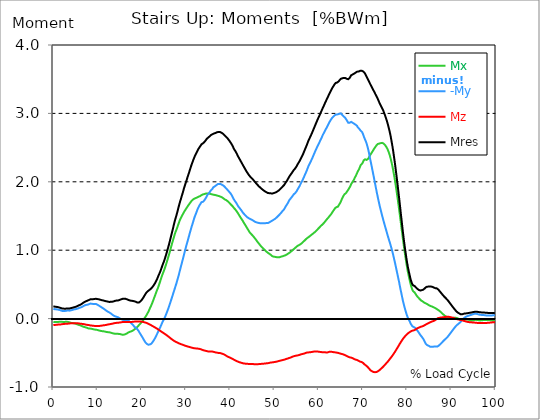
| Category |  Mx |  -My |  Mz |  Mres |
|---|---|---|---|---|
| 0.0 | -0.05 | 0.145 | -0.094 | 0.181 |
| 0.167348456675344 | -0.05 | 0.139 | -0.094 | 0.177 |
| 0.334696913350688 | -0.052 | 0.137 | -0.093 | 0.174 |
| 0.5020453700260321 | -0.052 | 0.135 | -0.092 | 0.173 |
| 0.669393826701376 | -0.05 | 0.135 | -0.09 | 0.172 |
| 0.83674228337672 | -0.052 | 0.133 | -0.089 | 0.169 |
| 1.0040907400520642 | -0.05 | 0.132 | -0.088 | 0.168 |
| 1.1621420602454444 | -0.048 | 0.13 | -0.086 | 0.165 |
| 1.3294905169207885 | -0.046 | 0.129 | -0.086 | 0.163 |
| 1.4968389735961325 | -0.045 | 0.125 | -0.085 | 0.16 |
| 1.6641874302714765 | -0.045 | 0.12 | -0.085 | 0.155 |
| 1.8315358869468206 | -0.046 | 0.115 | -0.084 | 0.151 |
| 1.9988843436221646 | -0.048 | 0.112 | -0.081 | 0.148 |
| 2.1662328002975086 | -0.048 | 0.111 | -0.08 | 0.147 |
| 2.333581256972853 | -0.049 | 0.111 | -0.079 | 0.146 |
| 2.5009297136481967 | -0.049 | 0.111 | -0.077 | 0.146 |
| 2.6682781703235405 | -0.048 | 0.112 | -0.076 | 0.145 |
| 2.8356266269988843 | -0.045 | 0.114 | -0.075 | 0.145 |
| 3.002975083674229 | -0.046 | 0.116 | -0.075 | 0.147 |
| 3.1703235403495724 | -0.048 | 0.12 | -0.075 | 0.15 |
| 3.337671997024917 | -0.049 | 0.119 | -0.074 | 0.148 |
| 3.4957233172182973 | -0.053 | 0.117 | -0.072 | 0.148 |
| 3.663071773893641 | -0.055 | 0.116 | -0.071 | 0.148 |
| 3.8304202305689854 | -0.058 | 0.119 | -0.07 | 0.151 |
| 3.997768687244329 | -0.062 | 0.121 | -0.068 | 0.154 |
| 4.165117143919673 | -0.065 | 0.125 | -0.068 | 0.156 |
| 4.332465600595017 | -0.066 | 0.128 | -0.067 | 0.159 |
| 4.499814057270361 | -0.067 | 0.13 | -0.067 | 0.163 |
| 4.667162513945706 | -0.068 | 0.134 | -0.068 | 0.165 |
| 4.834510970621049 | -0.071 | 0.135 | -0.07 | 0.169 |
| 5.001859427296393 | -0.074 | 0.138 | -0.07 | 0.172 |
| 5.169207883971737 | -0.077 | 0.141 | -0.07 | 0.175 |
| 5.336556340647081 | -0.083 | 0.143 | -0.07 | 0.179 |
| 5.503904797322425 | -0.089 | 0.146 | -0.07 | 0.185 |
| 5.671253253997769 | -0.09 | 0.151 | -0.07 | 0.191 |
| 5.82930457419115 | -0.093 | 0.156 | -0.071 | 0.195 |
| 5.996653030866494 | -0.097 | 0.16 | -0.074 | 0.2 |
| 6.164001487541838 | -0.101 | 0.163 | -0.075 | 0.205 |
| 6.331349944217181 | -0.106 | 0.166 | -0.076 | 0.212 |
| 6.498698400892526 | -0.112 | 0.172 | -0.077 | 0.219 |
| 6.66604685756787 | -0.116 | 0.178 | -0.079 | 0.227 |
| 6.833395314243213 | -0.12 | 0.185 | -0.08 | 0.235 |
| 7.000743770918558 | -0.123 | 0.191 | -0.083 | 0.241 |
| 7.168092227593902 | -0.126 | 0.196 | -0.085 | 0.249 |
| 7.335440684269246 | -0.129 | 0.199 | -0.088 | 0.253 |
| 7.50278914094459 | -0.133 | 0.201 | -0.09 | 0.257 |
| 7.6701375976199335 | -0.137 | 0.203 | -0.092 | 0.261 |
| 7.837486054295278 | -0.141 | 0.205 | -0.093 | 0.266 |
| 7.995537374488658 | -0.145 | 0.209 | -0.094 | 0.271 |
| 8.162885831164003 | -0.146 | 0.213 | -0.097 | 0.276 |
| 8.330234287839346 | -0.146 | 0.219 | -0.099 | 0.281 |
| 8.49758274451469 | -0.147 | 0.221 | -0.101 | 0.284 |
| 8.664931201190035 | -0.15 | 0.218 | -0.102 | 0.284 |
| 8.832279657865378 | -0.151 | 0.215 | -0.103 | 0.283 |
| 8.999628114540721 | -0.155 | 0.213 | -0.105 | 0.284 |
| 9.166976571216066 | -0.159 | 0.214 | -0.106 | 0.286 |
| 9.334325027891412 | -0.16 | 0.214 | -0.107 | 0.288 |
| 9.501673484566755 | -0.161 | 0.214 | -0.107 | 0.289 |
| 9.669021941242098 | -0.163 | 0.213 | -0.107 | 0.289 |
| 9.836370397917442 | -0.164 | 0.208 | -0.108 | 0.286 |
| 10.003718854592787 | -0.166 | 0.203 | -0.108 | 0.285 |
| 10.17106731126813 | -0.169 | 0.196 | -0.108 | 0.283 |
| 10.329118631461512 | -0.174 | 0.188 | -0.107 | 0.281 |
| 10.496467088136853 | -0.178 | 0.182 | -0.107 | 0.279 |
| 10.663815544812199 | -0.179 | 0.174 | -0.106 | 0.275 |
| 10.831164001487544 | -0.182 | 0.166 | -0.103 | 0.271 |
| 10.998512458162887 | -0.183 | 0.16 | -0.102 | 0.268 |
| 11.16586091483823 | -0.185 | 0.154 | -0.099 | 0.266 |
| 11.333209371513574 | -0.186 | 0.147 | -0.098 | 0.265 |
| 11.50055782818892 | -0.187 | 0.139 | -0.097 | 0.262 |
| 11.667906284864264 | -0.19 | 0.13 | -0.095 | 0.258 |
| 11.835254741539607 | -0.192 | 0.123 | -0.094 | 0.255 |
| 12.00260319821495 | -0.195 | 0.115 | -0.092 | 0.253 |
| 12.169951654890292 | -0.197 | 0.108 | -0.089 | 0.25 |
| 12.337300111565641 | -0.199 | 0.101 | -0.086 | 0.248 |
| 12.504648568240984 | -0.199 | 0.094 | -0.084 | 0.245 |
| 12.662699888434362 | -0.2 | 0.089 | -0.083 | 0.244 |
| 12.830048345109708 | -0.203 | 0.083 | -0.08 | 0.244 |
| 12.997396801785053 | -0.206 | 0.075 | -0.079 | 0.245 |
| 13.164745258460396 | -0.21 | 0.066 | -0.077 | 0.245 |
| 13.33209371513574 | -0.213 | 0.058 | -0.075 | 0.246 |
| 13.499442171811083 | -0.215 | 0.05 | -0.072 | 0.248 |
| 13.666790628486426 | -0.218 | 0.043 | -0.068 | 0.253 |
| 13.834139085161771 | -0.221 | 0.037 | -0.067 | 0.258 |
| 14.001487541837117 | -0.222 | 0.032 | -0.065 | 0.261 |
| 14.16883599851246 | -0.222 | 0.027 | -0.063 | 0.262 |
| 14.336184455187803 | -0.223 | 0.026 | -0.062 | 0.265 |
| 14.503532911863147 | -0.223 | 0.023 | -0.062 | 0.266 |
| 14.670881368538492 | -0.223 | 0.018 | -0.061 | 0.266 |
| 14.828932688731873 | -0.223 | 0.01 | -0.058 | 0.27 |
| 14.996281145407215 | -0.225 | 0.004 | -0.057 | 0.274 |
| 15.163629602082558 | -0.227 | -0.003 | -0.055 | 0.277 |
| 15.330978058757903 | -0.231 | -0.008 | -0.054 | 0.283 |
| 15.498326515433247 | -0.234 | -0.013 | -0.052 | 0.286 |
| 15.665674972108594 | -0.236 | -0.018 | -0.05 | 0.289 |
| 15.833023428783937 | -0.235 | -0.019 | -0.05 | 0.289 |
| 16.00037188545928 | -0.234 | -0.019 | -0.049 | 0.29 |
| 16.167720342134626 | -0.232 | -0.019 | -0.049 | 0.292 |
| 16.335068798809967 | -0.227 | -0.021 | -0.05 | 0.289 |
| 16.502417255485312 | -0.222 | -0.022 | -0.05 | 0.285 |
| 16.669765712160658 | -0.215 | -0.025 | -0.05 | 0.281 |
| 16.837114168836 | -0.208 | -0.027 | -0.052 | 0.276 |
| 17.004462625511344 | -0.201 | -0.031 | -0.052 | 0.272 |
| 17.16251394570472 | -0.196 | -0.039 | -0.052 | 0.268 |
| 17.32986240238007 | -0.192 | -0.049 | -0.05 | 0.265 |
| 17.497210859055414 | -0.19 | -0.061 | -0.049 | 0.263 |
| 17.664559315730756 | -0.185 | -0.071 | -0.049 | 0.261 |
| 17.8319077724061 | -0.179 | -0.081 | -0.048 | 0.259 |
| 17.999256229081443 | -0.174 | -0.093 | -0.046 | 0.258 |
| 18.166604685756788 | -0.166 | -0.107 | -0.045 | 0.255 |
| 18.333953142432133 | -0.157 | -0.12 | -0.044 | 0.253 |
| 18.501301599107478 | -0.148 | -0.13 | -0.044 | 0.253 |
| 18.668650055782823 | -0.141 | -0.135 | -0.044 | 0.245 |
| 18.835998512458165 | -0.132 | -0.145 | -0.044 | 0.237 |
| 19.00334696913351 | -0.121 | -0.156 | -0.044 | 0.235 |
| 19.170695425808855 | -0.108 | -0.17 | -0.043 | 0.232 |
| 19.338043882484197 | -0.097 | -0.187 | -0.043 | 0.235 |
| 19.496095202677576 | -0.086 | -0.208 | -0.043 | 0.243 |
| 19.66344365935292 | -0.074 | -0.223 | -0.043 | 0.25 |
| 19.830792116028263 | -0.061 | -0.243 | -0.044 | 0.263 |
| 19.998140572703612 | -0.048 | -0.259 | -0.045 | 0.275 |
| 20.165489029378953 | -0.035 | -0.276 | -0.046 | 0.288 |
| 20.3328374860543 | -0.021 | -0.297 | -0.049 | 0.306 |
| 20.500185942729644 | -0.005 | -0.315 | -0.052 | 0.324 |
| 20.667534399404985 | 0.012 | -0.333 | -0.055 | 0.343 |
| 20.83488285608033 | 0.027 | -0.35 | -0.058 | 0.36 |
| 21.002231312755672 | 0.044 | -0.364 | -0.062 | 0.377 |
| 21.16957976943102 | 0.063 | -0.372 | -0.067 | 0.387 |
| 21.336928226106362 | 0.083 | -0.378 | -0.071 | 0.399 |
| 21.504276682781704 | 0.103 | -0.382 | -0.076 | 0.408 |
| 21.67162513945705 | 0.126 | -0.382 | -0.081 | 0.417 |
| 21.82967645965043 | 0.151 | -0.378 | -0.086 | 0.426 |
| 21.997024916325774 | 0.174 | -0.373 | -0.093 | 0.434 |
| 22.16437337300112 | 0.199 | -0.366 | -0.099 | 0.443 |
| 22.33172182967646 | 0.225 | -0.354 | -0.106 | 0.455 |
| 22.499070286351806 | 0.253 | -0.337 | -0.112 | 0.47 |
| 22.666418743027148 | 0.281 | -0.321 | -0.117 | 0.485 |
| 22.833767199702496 | 0.311 | -0.303 | -0.124 | 0.502 |
| 23.00111565637784 | 0.339 | -0.284 | -0.13 | 0.52 |
| 23.168464113053183 | 0.369 | -0.263 | -0.137 | 0.539 |
| 23.335812569728528 | 0.399 | -0.24 | -0.143 | 0.561 |
| 23.50316102640387 | 0.426 | -0.218 | -0.15 | 0.586 |
| 23.670509483079215 | 0.452 | -0.194 | -0.156 | 0.612 |
| 23.83785793975456 | 0.483 | -0.169 | -0.164 | 0.639 |
| 23.995909259947936 | 0.515 | -0.148 | -0.172 | 0.662 |
| 24.163257716623285 | 0.548 | -0.126 | -0.179 | 0.688 |
| 24.330606173298627 | 0.581 | -0.102 | -0.187 | 0.717 |
| 24.49795462997397 | 0.613 | -0.076 | -0.194 | 0.747 |
| 24.665303086649313 | 0.645 | -0.05 | -0.201 | 0.779 |
| 24.83265154332466 | 0.674 | -0.03 | -0.208 | 0.808 |
| 25.0 | 0.699 | -0.012 | -0.215 | 0.835 |
| 25.167348456675345 | 0.73 | 0.012 | -0.222 | 0.867 |
| 25.334696913350694 | 0.763 | 0.037 | -0.23 | 0.902 |
| 25.502045370026035 | 0.796 | 0.063 | -0.237 | 0.937 |
| 25.669393826701377 | 0.831 | 0.092 | -0.245 | 0.973 |
| 25.836742283376722 | 0.866 | 0.12 | -0.253 | 1.012 |
| 26.004090740052067 | 0.903 | 0.15 | -0.262 | 1.05 |
| 26.17143919672741 | 0.941 | 0.181 | -0.27 | 1.09 |
| 26.329490516920792 | 0.978 | 0.213 | -0.279 | 1.132 |
| 26.49683897359613 | 1.018 | 0.245 | -0.288 | 1.175 |
| 26.66418743027148 | 1.058 | 0.28 | -0.297 | 1.219 |
| 26.831535886946828 | 1.098 | 0.312 | -0.306 | 1.263 |
| 26.998884343622166 | 1.134 | 0.347 | -0.312 | 1.307 |
| 27.166232800297514 | 1.172 | 0.382 | -0.32 | 1.351 |
| 27.333581256972852 | 1.208 | 0.415 | -0.328 | 1.395 |
| 27.5009297136482 | 1.244 | 0.449 | -0.334 | 1.437 |
| 27.668278170323543 | 1.274 | 0.484 | -0.339 | 1.475 |
| 27.835626626998888 | 1.301 | 0.517 | -0.343 | 1.511 |
| 28.002975083674233 | 1.33 | 0.556 | -0.348 | 1.551 |
| 28.170323540349575 | 1.361 | 0.594 | -0.354 | 1.592 |
| 28.33767199702492 | 1.392 | 0.632 | -0.36 | 1.635 |
| 28.50502045370026 | 1.422 | 0.676 | -0.364 | 1.676 |
| 28.663071773893645 | 1.449 | 0.719 | -0.369 | 1.714 |
| 28.830420230568986 | 1.471 | 0.76 | -0.373 | 1.748 |
| 28.99776868724433 | 1.493 | 0.8 | -0.377 | 1.786 |
| 29.165117143919673 | 1.514 | 0.841 | -0.381 | 1.821 |
| 29.33246560059502 | 1.533 | 0.884 | -0.385 | 1.857 |
| 29.499814057270367 | 1.554 | 0.925 | -0.388 | 1.897 |
| 29.66716251394571 | 1.572 | 0.968 | -0.394 | 1.933 |
| 29.834510970621054 | 1.588 | 1.01 | -0.397 | 1.965 |
| 30.00185942729639 | 1.605 | 1.052 | -0.4 | 1.999 |
| 30.169207883971744 | 1.622 | 1.09 | -0.404 | 2.032 |
| 30.33655634064708 | 1.637 | 1.128 | -0.408 | 2.067 |
| 30.50390479732243 | 1.654 | 1.168 | -0.41 | 2.099 |
| 30.671253253997772 | 1.67 | 1.206 | -0.413 | 2.132 |
| 30.829304574191156 | 1.685 | 1.246 | -0.417 | 2.166 |
| 30.996653030866494 | 1.699 | 1.284 | -0.419 | 2.2 |
| 31.164001487541842 | 1.714 | 1.323 | -0.423 | 2.235 |
| 31.331349944217187 | 1.726 | 1.359 | -0.426 | 2.266 |
| 31.498698400892525 | 1.737 | 1.392 | -0.428 | 2.294 |
| 31.666046857567874 | 1.746 | 1.428 | -0.431 | 2.324 |
| 31.833395314243212 | 1.752 | 1.465 | -0.434 | 2.351 |
| 32.00074377091856 | 1.757 | 1.497 | -0.435 | 2.377 |
| 32.1680922275939 | 1.763 | 1.523 | -0.435 | 2.399 |
| 32.33544068426925 | 1.766 | 1.551 | -0.436 | 2.421 |
| 32.50278914094459 | 1.77 | 1.581 | -0.437 | 2.444 |
| 32.670137597619934 | 1.775 | 1.608 | -0.439 | 2.465 |
| 32.83748605429528 | 1.782 | 1.628 | -0.441 | 2.484 |
| 33.004834510970625 | 1.787 | 1.652 | -0.443 | 2.501 |
| 33.162885831164004 | 1.791 | 1.668 | -0.445 | 2.515 |
| 33.33023428783935 | 1.797 | 1.686 | -0.448 | 2.532 |
| 33.497582744514695 | 1.805 | 1.702 | -0.452 | 2.548 |
| 33.664931201190036 | 1.81 | 1.705 | -0.457 | 2.555 |
| 33.83227965786538 | 1.817 | 1.708 | -0.462 | 2.563 |
| 33.99962811454073 | 1.821 | 1.72 | -0.465 | 2.575 |
| 34.16697657121607 | 1.821 | 1.732 | -0.467 | 2.583 |
| 34.33432502789141 | 1.825 | 1.748 | -0.47 | 2.596 |
| 34.50167348456676 | 1.828 | 1.766 | -0.472 | 2.612 |
| 34.6690219412421 | 1.83 | 1.787 | -0.475 | 2.627 |
| 34.83637039791744 | 1.828 | 1.809 | -0.476 | 2.641 |
| 35.00371885459279 | 1.828 | 1.815 | -0.48 | 2.646 |
| 35.17106731126814 | 1.828 | 1.832 | -0.481 | 2.658 |
| 35.338415767943474 | 1.827 | 1.843 | -0.483 | 2.665 |
| 35.49646708813686 | 1.823 | 1.863 | -0.48 | 2.676 |
| 35.6638155448122 | 1.821 | 1.879 | -0.48 | 2.685 |
| 35.831164001487544 | 1.817 | 1.893 | -0.481 | 2.693 |
| 35.998512458162885 | 1.815 | 1.901 | -0.483 | 2.697 |
| 36.165860914838234 | 1.812 | 1.92 | -0.484 | 2.705 |
| 36.333209371513576 | 1.809 | 1.926 | -0.488 | 2.707 |
| 36.50055782818892 | 1.808 | 1.933 | -0.492 | 2.71 |
| 36.667906284864266 | 1.806 | 1.941 | -0.494 | 2.714 |
| 36.83525474153961 | 1.803 | 1.95 | -0.495 | 2.719 |
| 37.002603198214956 | 1.796 | 1.961 | -0.498 | 2.724 |
| 37.1699516548903 | 1.796 | 1.966 | -0.499 | 2.728 |
| 37.337300111565646 | 1.794 | 1.969 | -0.502 | 2.729 |
| 37.50464856824098 | 1.79 | 1.969 | -0.502 | 2.728 |
| 37.66269988843437 | 1.786 | 1.97 | -0.503 | 2.728 |
| 37.83004834510971 | 1.782 | 1.966 | -0.506 | 2.724 |
| 37.99739680178505 | 1.777 | 1.963 | -0.51 | 2.719 |
| 38.16474525846039 | 1.772 | 1.955 | -0.512 | 2.711 |
| 38.33209371513574 | 1.764 | 1.948 | -0.516 | 2.703 |
| 38.49944217181109 | 1.755 | 1.942 | -0.521 | 2.694 |
| 38.666790628486424 | 1.747 | 1.93 | -0.526 | 2.683 |
| 38.83413908516178 | 1.739 | 1.92 | -0.533 | 2.671 |
| 39.001487541837115 | 1.734 | 1.908 | -0.539 | 2.662 |
| 39.16883599851246 | 1.729 | 1.898 | -0.546 | 2.654 |
| 39.336184455187805 | 1.72 | 1.885 | -0.554 | 2.64 |
| 39.503532911863154 | 1.711 | 1.872 | -0.559 | 2.626 |
| 39.670881368538495 | 1.701 | 1.859 | -0.563 | 2.612 |
| 39.83822982521384 | 1.689 | 1.848 | -0.568 | 2.596 |
| 39.996281145407224 | 1.677 | 1.836 | -0.573 | 2.582 |
| 40.163629602082565 | 1.666 | 1.822 | -0.577 | 2.565 |
| 40.33097805875791 | 1.657 | 1.803 | -0.583 | 2.547 |
| 40.498326515433256 | 1.645 | 1.782 | -0.59 | 2.526 |
| 40.6656749721086 | 1.631 | 1.761 | -0.595 | 2.505 |
| 40.83302342878393 | 1.617 | 1.741 | -0.6 | 2.481 |
| 41.00037188545929 | 1.604 | 1.724 | -0.606 | 2.463 |
| 41.16772034213463 | 1.594 | 1.71 | -0.612 | 2.448 |
| 41.33506879880997 | 1.581 | 1.693 | -0.618 | 2.428 |
| 41.50241725548531 | 1.564 | 1.676 | -0.623 | 2.408 |
| 41.66976571216066 | 1.547 | 1.655 | -0.627 | 2.385 |
| 41.837114168836 | 1.53 | 1.639 | -0.632 | 2.364 |
| 42.004462625511344 | 1.512 | 1.625 | -0.636 | 2.345 |
| 42.17181108218669 | 1.495 | 1.612 | -0.639 | 2.325 |
| 42.32986240238007 | 1.477 | 1.599 | -0.643 | 2.306 |
| 42.497210859055414 | 1.461 | 1.583 | -0.646 | 2.286 |
| 42.66455931573076 | 1.444 | 1.568 | -0.649 | 2.267 |
| 42.831907772406105 | 1.428 | 1.55 | -0.653 | 2.246 |
| 42.999256229081446 | 1.409 | 1.541 | -0.655 | 2.228 |
| 43.16660468575679 | 1.391 | 1.526 | -0.657 | 2.209 |
| 43.33395314243214 | 1.374 | 1.514 | -0.658 | 2.19 |
| 43.50130159910748 | 1.356 | 1.503 | -0.659 | 2.172 |
| 43.66865005578282 | 1.338 | 1.49 | -0.661 | 2.152 |
| 43.83599851245817 | 1.32 | 1.483 | -0.661 | 2.135 |
| 44.00334696913351 | 1.302 | 1.475 | -0.662 | 2.12 |
| 44.17069542580886 | 1.285 | 1.468 | -0.662 | 2.103 |
| 44.3380438824842 | 1.267 | 1.462 | -0.662 | 2.089 |
| 44.49609520267758 | 1.252 | 1.457 | -0.663 | 2.075 |
| 44.66344365935292 | 1.237 | 1.454 | -0.663 | 2.065 |
| 44.83079211602827 | 1.23 | 1.446 | -0.665 | 2.054 |
| 44.99814057270361 | 1.219 | 1.441 | -0.665 | 2.044 |
| 45.16548902937895 | 1.206 | 1.434 | -0.665 | 2.031 |
| 45.332837486054295 | 1.192 | 1.427 | -0.666 | 2.017 |
| 45.500185942729644 | 1.179 | 1.419 | -0.666 | 2.004 |
| 45.66753439940499 | 1.165 | 1.414 | -0.667 | 1.991 |
| 45.83488285608033 | 1.151 | 1.409 | -0.667 | 1.979 |
| 46.00223131275568 | 1.137 | 1.406 | -0.667 | 1.968 |
| 46.16957976943102 | 1.121 | 1.403 | -0.667 | 1.955 |
| 46.336928226106366 | 1.107 | 1.401 | -0.666 | 1.943 |
| 46.50427668278171 | 1.094 | 1.397 | -0.666 | 1.932 |
| 46.671625139457056 | 1.08 | 1.395 | -0.665 | 1.921 |
| 46.829676459650436 | 1.067 | 1.394 | -0.663 | 1.912 |
| 46.99702491632577 | 1.054 | 1.395 | -0.662 | 1.902 |
| 47.16437337300112 | 1.043 | 1.394 | -0.661 | 1.893 |
| 47.33172182967646 | 1.031 | 1.394 | -0.659 | 1.884 |
| 47.49907028635181 | 1.021 | 1.394 | -0.659 | 1.876 |
| 47.66641874302716 | 1.01 | 1.394 | -0.658 | 1.868 |
| 47.83376719970249 | 1.001 | 1.394 | -0.657 | 1.861 |
| 48.001115656377834 | 0.99 | 1.395 | -0.655 | 1.854 |
| 48.16846411305319 | 0.979 | 1.397 | -0.654 | 1.848 |
| 48.33581256972853 | 0.97 | 1.397 | -0.653 | 1.843 |
| 48.50316102640387 | 0.963 | 1.397 | -0.652 | 1.836 |
| 48.67050948307921 | 0.955 | 1.401 | -0.65 | 1.834 |
| 48.837857939754564 | 0.948 | 1.406 | -0.648 | 1.834 |
| 49.005206396429905 | 0.939 | 1.415 | -0.644 | 1.834 |
| 49.163257716623285 | 0.932 | 1.421 | -0.643 | 1.831 |
| 49.33060617329863 | 0.92 | 1.428 | -0.641 | 1.83 |
| 49.49795462997397 | 0.912 | 1.432 | -0.64 | 1.828 |
| 49.66530308664932 | 0.91 | 1.439 | -0.639 | 1.831 |
| 49.832651543324666 | 0.906 | 1.446 | -0.637 | 1.835 |
| 50.0 | 0.903 | 1.453 | -0.635 | 1.839 |
| 50.16734845667534 | 0.902 | 1.461 | -0.634 | 1.843 |
| 50.33469691335069 | 0.901 | 1.468 | -0.631 | 1.846 |
| 50.50204537002604 | 0.898 | 1.479 | -0.63 | 1.853 |
| 50.66939382670139 | 0.895 | 1.49 | -0.626 | 1.861 |
| 50.836742283376715 | 0.895 | 1.501 | -0.623 | 1.867 |
| 51.00409074005207 | 0.895 | 1.512 | -0.619 | 1.876 |
| 51.17143919672741 | 0.898 | 1.523 | -0.617 | 1.885 |
| 51.32949051692079 | 0.902 | 1.533 | -0.614 | 1.894 |
| 51.496838973596134 | 0.906 | 1.547 | -0.612 | 1.907 |
| 51.66418743027148 | 0.908 | 1.56 | -0.609 | 1.919 |
| 51.831535886946824 | 0.911 | 1.574 | -0.606 | 1.93 |
| 51.99888434362217 | 0.916 | 1.586 | -0.604 | 1.941 |
| 52.16623280029752 | 0.92 | 1.597 | -0.6 | 1.952 |
| 52.33358125697285 | 0.924 | 1.617 | -0.597 | 1.969 |
| 52.5009297136482 | 0.926 | 1.637 | -0.594 | 1.986 |
| 52.668278170323546 | 0.932 | 1.653 | -0.59 | 2.001 |
| 52.835626626998895 | 0.939 | 1.667 | -0.587 | 2.017 |
| 53.00297508367424 | 0.947 | 1.688 | -0.583 | 2.036 |
| 53.17032354034958 | 0.954 | 1.71 | -0.579 | 2.057 |
| 53.33767199702492 | 0.961 | 1.729 | -0.575 | 2.075 |
| 53.50502045370027 | 0.968 | 1.745 | -0.573 | 2.092 |
| 53.663071773893655 | 0.975 | 1.759 | -0.569 | 2.107 |
| 53.83042023056899 | 0.986 | 1.77 | -0.565 | 2.121 |
| 53.99776868724433 | 0.996 | 1.785 | -0.559 | 2.137 |
| 54.16511714391967 | 1.006 | 1.8 | -0.552 | 2.154 |
| 54.33246560059503 | 1.015 | 1.815 | -0.551 | 2.17 |
| 54.49981405727037 | 1.023 | 1.826 | -0.547 | 2.183 |
| 54.667162513945705 | 1.034 | 1.835 | -0.545 | 2.195 |
| 54.834510970621054 | 1.043 | 1.848 | -0.542 | 2.21 |
| 55.0018594272964 | 1.053 | 1.862 | -0.541 | 2.227 |
| 55.169207883971744 | 1.061 | 1.883 | -0.539 | 2.249 |
| 55.336556340647086 | 1.067 | 1.901 | -0.537 | 2.267 |
| 55.50390479732243 | 1.074 | 1.919 | -0.534 | 2.284 |
| 55.671253253997776 | 1.079 | 1.938 | -0.53 | 2.303 |
| 55.83860171067312 | 1.085 | 1.96 | -0.526 | 2.324 |
| 55.9966530308665 | 1.093 | 1.982 | -0.523 | 2.345 |
| 56.16400148754184 | 1.102 | 2.003 | -0.52 | 2.366 |
| 56.33134994421718 | 1.111 | 2.022 | -0.517 | 2.387 |
| 56.498698400892536 | 1.123 | 2.046 | -0.515 | 2.412 |
| 56.66604685756788 | 1.133 | 2.071 | -0.512 | 2.439 |
| 56.83339531424321 | 1.143 | 2.095 | -0.508 | 2.465 |
| 57.00074377091856 | 1.155 | 2.12 | -0.503 | 2.49 |
| 57.16809222759391 | 1.165 | 2.145 | -0.501 | 2.516 |
| 57.33544068426925 | 1.173 | 2.17 | -0.497 | 2.542 |
| 57.5027891409446 | 1.182 | 2.2 | -0.495 | 2.572 |
| 57.670137597619934 | 1.19 | 2.227 | -0.494 | 2.6 |
| 57.83748605429528 | 1.197 | 2.249 | -0.494 | 2.622 |
| 58.004834510970625 | 1.208 | 2.271 | -0.493 | 2.646 |
| 58.16288583116401 | 1.215 | 2.294 | -0.492 | 2.67 |
| 58.330234287839346 | 1.225 | 2.316 | -0.489 | 2.693 |
| 58.497582744514695 | 1.232 | 2.339 | -0.488 | 2.717 |
| 58.66493120119004 | 1.24 | 2.364 | -0.485 | 2.742 |
| 58.832279657865385 | 1.249 | 2.391 | -0.483 | 2.769 |
| 58.999628114540734 | 1.258 | 2.415 | -0.481 | 2.795 |
| 59.16697657121607 | 1.267 | 2.44 | -0.48 | 2.821 |
| 59.33432502789142 | 1.277 | 2.466 | -0.48 | 2.848 |
| 59.50167348456676 | 1.289 | 2.488 | -0.481 | 2.871 |
| 59.66902194124211 | 1.299 | 2.514 | -0.481 | 2.899 |
| 59.83637039791745 | 1.311 | 2.535 | -0.483 | 2.923 |
| 60.00371885459278 | 1.321 | 2.556 | -0.484 | 2.946 |
| 60.17106731126813 | 1.333 | 2.578 | -0.486 | 2.969 |
| 60.33841576794349 | 1.345 | 2.601 | -0.488 | 2.994 |
| 60.49646708813685 | 1.356 | 2.625 | -0.489 | 3.018 |
| 60.6638155448122 | 1.366 | 2.646 | -0.49 | 3.043 |
| 60.831164001487544 | 1.375 | 2.672 | -0.49 | 3.067 |
| 60.99851245816289 | 1.386 | 2.694 | -0.49 | 3.09 |
| 61.16586091483824 | 1.397 | 2.715 | -0.492 | 3.114 |
| 61.333209371513576 | 1.41 | 2.737 | -0.493 | 3.138 |
| 61.50055782818892 | 1.425 | 2.757 | -0.493 | 3.163 |
| 61.667906284864266 | 1.437 | 2.777 | -0.494 | 3.186 |
| 61.835254741539615 | 1.452 | 2.795 | -0.495 | 3.208 |
| 62.002603198214956 | 1.465 | 2.817 | -0.494 | 3.23 |
| 62.16995165489029 | 1.476 | 2.84 | -0.49 | 3.254 |
| 62.33730011156564 | 1.49 | 2.862 | -0.486 | 3.277 |
| 62.504648568240995 | 1.503 | 2.881 | -0.485 | 3.299 |
| 62.67199702491633 | 1.515 | 2.899 | -0.484 | 3.32 |
| 62.83004834510971 | 1.529 | 2.916 | -0.485 | 3.341 |
| 62.99739680178505 | 1.546 | 2.932 | -0.486 | 3.363 |
| 63.1647452584604 | 1.564 | 2.945 | -0.49 | 3.383 |
| 63.33209371513575 | 1.577 | 2.955 | -0.49 | 3.399 |
| 63.4994421718111 | 1.595 | 2.966 | -0.492 | 3.418 |
| 63.666790628486424 | 1.612 | 2.975 | -0.493 | 3.432 |
| 63.83413908516177 | 1.626 | 2.981 | -0.494 | 3.445 |
| 64.00148754183712 | 1.63 | 2.983 | -0.497 | 3.45 |
| 64.16883599851248 | 1.631 | 2.985 | -0.498 | 3.452 |
| 64.3361844551878 | 1.636 | 2.987 | -0.501 | 3.457 |
| 64.50353291186315 | 1.65 | 2.99 | -0.505 | 3.467 |
| 64.6708813685385 | 1.671 | 2.995 | -0.507 | 3.483 |
| 64.83822982521384 | 1.69 | 2.999 | -0.51 | 3.495 |
| 65.00557828188919 | 1.71 | 3 | -0.514 | 3.506 |
| 65.16362960208257 | 1.738 | 2.99 | -0.515 | 3.511 |
| 65.3309780587579 | 1.763 | 2.977 | -0.519 | 3.514 |
| 65.49832651543326 | 1.782 | 2.964 | -0.523 | 3.514 |
| 65.6656749721086 | 1.803 | 2.955 | -0.526 | 3.519 |
| 65.83302342878395 | 1.818 | 2.947 | -0.53 | 3.523 |
| 66.00037188545929 | 1.826 | 2.934 | -0.535 | 3.517 |
| 66.16772034213463 | 1.835 | 2.92 | -0.541 | 3.512 |
| 66.33506879880998 | 1.848 | 2.901 | -0.547 | 3.506 |
| 66.50241725548531 | 1.867 | 2.883 | -0.552 | 3.503 |
| 66.66976571216065 | 1.884 | 2.863 | -0.557 | 3.499 |
| 66.83711416883601 | 1.901 | 2.861 | -0.563 | 3.508 |
| 67.00446262551135 | 1.915 | 2.865 | -0.566 | 3.519 |
| 67.1718110821867 | 1.939 | 2.871 | -0.569 | 3.538 |
| 67.32986240238007 | 1.965 | 2.876 | -0.57 | 3.557 |
| 67.49721085905541 | 1.983 | 2.875 | -0.574 | 3.566 |
| 67.66455931573076 | 2 | 2.863 | -0.578 | 3.569 |
| 67.83190777240611 | 2.017 | 2.853 | -0.585 | 3.572 |
| 67.99925622908145 | 2.037 | 2.849 | -0.591 | 3.581 |
| 68.16660468575678 | 2.061 | 2.844 | -0.596 | 3.59 |
| 68.33395314243214 | 2.081 | 2.835 | -0.6 | 3.596 |
| 68.50130159910749 | 2.103 | 2.828 | -0.603 | 3.603 |
| 68.66865005578282 | 2.128 | 2.818 | -0.605 | 3.61 |
| 68.83599851245816 | 2.151 | 2.796 | -0.612 | 3.609 |
| 69.00334696913352 | 2.172 | 2.782 | -0.617 | 3.612 |
| 69.17069542580886 | 2.191 | 2.774 | -0.621 | 3.617 |
| 69.3380438824842 | 2.221 | 2.76 | -0.628 | 3.622 |
| 69.50539233915956 | 2.245 | 2.746 | -0.632 | 3.626 |
| 69.66344365935292 | 2.255 | 2.735 | -0.634 | 3.625 |
| 69.83079211602826 | 2.266 | 2.725 | -0.636 | 3.622 |
| 69.99814057270362 | 2.288 | 2.699 | -0.646 | 3.615 |
| 70.16548902937896 | 2.314 | 2.668 | -0.659 | 3.606 |
| 70.33283748605429 | 2.326 | 2.64 | -0.668 | 3.595 |
| 70.50018594272964 | 2.329 | 2.614 | -0.677 | 3.578 |
| 70.667534399405 | 2.321 | 2.59 | -0.684 | 3.556 |
| 70.83488285608033 | 2.32 | 2.557 | -0.693 | 3.534 |
| 71.00223131275568 | 2.325 | 2.521 | -0.703 | 3.514 |
| 71.16957976943102 | 2.337 | 2.48 | -0.715 | 3.493 |
| 71.33692822610637 | 2.354 | 2.431 | -0.726 | 3.472 |
| 71.50427668278171 | 2.374 | 2.375 | -0.741 | 3.448 |
| 71.67162513945706 | 2.394 | 2.321 | -0.754 | 3.426 |
| 71.8389735961324 | 2.41 | 2.27 | -0.761 | 3.405 |
| 71.99702491632577 | 2.428 | 2.219 | -0.768 | 3.386 |
| 72.16437337300113 | 2.444 | 2.161 | -0.775 | 3.361 |
| 72.33172182967647 | 2.463 | 2.108 | -0.779 | 3.342 |
| 72.49907028635181 | 2.48 | 2.054 | -0.782 | 3.323 |
| 72.66641874302715 | 2.497 | 1.999 | -0.783 | 3.301 |
| 72.8337671997025 | 2.512 | 1.942 | -0.783 | 3.279 |
| 73.00111565637783 | 2.528 | 1.888 | -0.782 | 3.258 |
| 73.16846411305319 | 2.541 | 1.834 | -0.778 | 3.237 |
| 73.33581256972853 | 2.552 | 1.782 | -0.773 | 3.215 |
| 73.50316102640387 | 2.556 | 1.732 | -0.765 | 3.19 |
| 73.67050948307921 | 2.559 | 1.683 | -0.757 | 3.164 |
| 73.83785793975457 | 2.563 | 1.635 | -0.748 | 3.141 |
| 74.00520639642991 | 2.565 | 1.591 | -0.738 | 3.119 |
| 74.16325771662328 | 2.568 | 1.548 | -0.729 | 3.098 |
| 74.33060617329863 | 2.569 | 1.506 | -0.719 | 3.076 |
| 74.49795462997398 | 2.566 | 1.467 | -0.707 | 3.055 |
| 74.66530308664932 | 2.559 | 1.426 | -0.697 | 3.028 |
| 74.83265154332466 | 2.55 | 1.387 | -0.685 | 2.999 |
| 75.00000000000001 | 2.537 | 1.348 | -0.674 | 2.97 |
| 75.16734845667534 | 2.523 | 1.312 | -0.661 | 2.939 |
| 75.3346969133507 | 2.505 | 1.274 | -0.649 | 2.906 |
| 75.50204537002605 | 2.485 | 1.236 | -0.637 | 2.87 |
| 75.66939382670138 | 2.461 | 1.199 | -0.625 | 2.831 |
| 75.83674228337672 | 2.432 | 1.163 | -0.61 | 2.79 |
| 76.00409074005208 | 2.401 | 1.128 | -0.597 | 2.746 |
| 76.17143919672742 | 2.364 | 1.092 | -0.583 | 2.697 |
| 76.33878765340276 | 2.321 | 1.055 | -0.569 | 2.641 |
| 76.49683897359614 | 2.276 | 1.015 | -0.556 | 2.582 |
| 76.66418743027148 | 2.226 | 0.974 | -0.541 | 2.519 |
| 76.83153588694682 | 2.17 | 0.932 | -0.525 | 2.45 |
| 76.99888434362218 | 2.11 | 0.885 | -0.508 | 2.377 |
| 77.16623280029752 | 2.049 | 0.837 | -0.493 | 2.301 |
| 77.33358125697285 | 1.981 | 0.79 | -0.476 | 2.218 |
| 77.5009297136482 | 1.908 | 0.738 | -0.458 | 2.132 |
| 77.66827817032356 | 1.835 | 0.689 | -0.44 | 2.044 |
| 77.83562662699889 | 1.76 | 0.637 | -0.423 | 1.955 |
| 78.00297508367423 | 1.681 | 0.587 | -0.405 | 1.862 |
| 78.17032354034959 | 1.601 | 0.537 | -0.386 | 1.769 |
| 78.33767199702493 | 1.52 | 0.48 | -0.368 | 1.672 |
| 78.50502045370027 | 1.436 | 0.426 | -0.351 | 1.574 |
| 78.67236891037561 | 1.351 | 0.375 | -0.333 | 1.477 |
| 78.83042023056899 | 1.267 | 0.324 | -0.317 | 1.381 |
| 78.99776868724433 | 1.183 | 0.271 | -0.301 | 1.285 |
| 79.16511714391969 | 1.102 | 0.226 | -0.286 | 1.195 |
| 79.33246560059503 | 1.022 | 0.183 | -0.272 | 1.108 |
| 79.49981405727036 | 0.947 | 0.143 | -0.259 | 1.028 |
| 79.66716251394571 | 0.875 | 0.106 | -0.248 | 0.952 |
| 79.83451097062107 | 0.805 | 0.071 | -0.236 | 0.879 |
| 80.00185942729641 | 0.739 | 0.039 | -0.226 | 0.812 |
| 80.16920788397174 | 0.681 | 0.01 | -0.215 | 0.751 |
| 80.33655634064709 | 0.63 | -0.01 | -0.208 | 0.699 |
| 80.50390479732243 | 0.581 | -0.031 | -0.2 | 0.652 |
| 80.67125325399778 | 0.533 | -0.055 | -0.194 | 0.604 |
| 80.83860171067312 | 0.489 | -0.079 | -0.187 | 0.561 |
| 80.99665303086651 | 0.453 | -0.095 | -0.181 | 0.529 |
| 81.16400148754184 | 0.423 | -0.111 | -0.177 | 0.503 |
| 81.3313499442172 | 0.401 | -0.12 | -0.174 | 0.486 |
| 81.49869840089255 | 0.391 | -0.124 | -0.173 | 0.481 |
| 81.66604685756786 | 0.383 | -0.128 | -0.168 | 0.477 |
| 81.83339531424322 | 0.37 | -0.137 | -0.16 | 0.468 |
| 82.00074377091858 | 0.351 | -0.151 | -0.154 | 0.454 |
| 82.16809222759392 | 0.333 | -0.164 | -0.147 | 0.444 |
| 82.33544068426926 | 0.32 | -0.177 | -0.141 | 0.434 |
| 82.50278914094459 | 0.308 | -0.192 | -0.137 | 0.423 |
| 82.67013759761994 | 0.297 | -0.209 | -0.132 | 0.418 |
| 82.83748605429528 | 0.285 | -0.226 | -0.126 | 0.414 |
| 83.00483451097062 | 0.272 | -0.241 | -0.121 | 0.41 |
| 83.17218296764597 | 0.263 | -0.254 | -0.119 | 0.41 |
| 83.33023428783935 | 0.259 | -0.268 | -0.115 | 0.417 |
| 83.4975827445147 | 0.252 | -0.284 | -0.111 | 0.422 |
| 83.66493120119004 | 0.244 | -0.299 | -0.107 | 0.423 |
| 83.83227965786537 | 0.235 | -0.32 | -0.102 | 0.431 |
| 83.99962811454073 | 0.23 | -0.343 | -0.094 | 0.444 |
| 84.16697657121607 | 0.225 | -0.365 | -0.088 | 0.457 |
| 84.33432502789142 | 0.219 | -0.379 | -0.083 | 0.463 |
| 84.50167348456677 | 0.213 | -0.387 | -0.076 | 0.467 |
| 84.6690219412421 | 0.204 | -0.392 | -0.071 | 0.467 |
| 84.83637039791745 | 0.199 | -0.396 | -0.066 | 0.467 |
| 85.0037188545928 | 0.192 | -0.404 | -0.061 | 0.47 |
| 85.17106731126813 | 0.187 | -0.41 | -0.055 | 0.471 |
| 85.33841576794349 | 0.183 | -0.412 | -0.05 | 0.47 |
| 85.50576422461883 | 0.179 | -0.412 | -0.048 | 0.466 |
| 85.66381554481221 | 0.175 | -0.413 | -0.041 | 0.465 |
| 85.83116400148755 | 0.17 | -0.412 | -0.036 | 0.462 |
| 85.99851245816289 | 0.166 | -0.409 | -0.034 | 0.455 |
| 86.16586091483823 | 0.16 | -0.406 | -0.027 | 0.45 |
| 86.33320937151358 | 0.154 | -0.405 | -0.022 | 0.445 |
| 86.50055782818893 | 0.148 | -0.406 | -0.014 | 0.443 |
| 86.66790628486427 | 0.141 | -0.412 | -0.005 | 0.443 |
| 86.83525474153961 | 0.133 | -0.409 | 0.003 | 0.435 |
| 87.00260319821496 | 0.125 | -0.404 | 0.008 | 0.427 |
| 87.16995165489031 | 0.119 | -0.394 | 0.009 | 0.414 |
| 87.33730011156564 | 0.111 | -0.383 | 0.012 | 0.403 |
| 87.504648568241 | 0.102 | -0.373 | 0.014 | 0.39 |
| 87.67199702491634 | 0.092 | -0.361 | 0.017 | 0.375 |
| 87.83004834510972 | 0.081 | -0.351 | 0.018 | 0.363 |
| 87.99739680178506 | 0.072 | -0.338 | 0.018 | 0.35 |
| 88.1647452584604 | 0.061 | -0.329 | 0.019 | 0.338 |
| 88.33209371513574 | 0.053 | -0.316 | 0.021 | 0.324 |
| 88.49944217181108 | 0.043 | -0.307 | 0.022 | 0.314 |
| 88.66679062848644 | 0.035 | -0.298 | 0.025 | 0.303 |
| 88.83413908516178 | 0.027 | -0.288 | 0.026 | 0.293 |
| 89.00148754183712 | 0.022 | -0.276 | 0.027 | 0.28 |
| 89.16883599851246 | 0.015 | -0.265 | 0.027 | 0.268 |
| 89.33618445518782 | 0.01 | -0.252 | 0.027 | 0.255 |
| 89.50353291186315 | 0.006 | -0.237 | 0.026 | 0.24 |
| 89.6708813685385 | 0.005 | -0.223 | 0.023 | 0.227 |
| 89.83822982521386 | 0.005 | -0.209 | 0.021 | 0.212 |
| 90.00557828188919 | 0.008 | -0.195 | 0.018 | 0.197 |
| 90.16362960208257 | 0.009 | -0.179 | 0.015 | 0.182 |
| 90.3309780587579 | 0.01 | -0.165 | 0.013 | 0.168 |
| 90.49832651543326 | 0.012 | -0.151 | 0.009 | 0.155 |
| 90.66567497210859 | 0.012 | -0.138 | 0.005 | 0.142 |
| 90.83302342878395 | 0.012 | -0.124 | 0.001 | 0.128 |
| 91.00037188545929 | 0.012 | -0.111 | -0.003 | 0.114 |
| 91.16772034213463 | 0.01 | -0.099 | -0.005 | 0.103 |
| 91.33506879880998 | 0.005 | -0.09 | -0.009 | 0.094 |
| 91.50241725548533 | 0.001 | -0.081 | -0.012 | 0.085 |
| 91.66976571216065 | -0.005 | -0.072 | -0.014 | 0.079 |
| 91.83711416883601 | -0.01 | -0.063 | -0.015 | 0.074 |
| 92.00446262551137 | -0.014 | -0.053 | -0.018 | 0.068 |
| 92.1718110821867 | -0.015 | -0.041 | -0.021 | 0.062 |
| 92.33915953886203 | -0.018 | -0.028 | -0.023 | 0.061 |
| 92.49721085905541 | -0.019 | -0.014 | -0.027 | 0.065 |
| 92.66455931573077 | -0.018 | -0.004 | -0.03 | 0.068 |
| 92.83190777240611 | -0.015 | 0.006 | -0.034 | 0.072 |
| 92.99925622908145 | -0.014 | 0.014 | -0.036 | 0.076 |
| 93.1666046857568 | -0.013 | 0.022 | -0.04 | 0.075 |
| 93.33395314243214 | -0.012 | 0.03 | -0.043 | 0.076 |
| 93.50130159910749 | -0.013 | 0.034 | -0.045 | 0.077 |
| 93.66865005578283 | -0.013 | 0.039 | -0.048 | 0.077 |
| 93.83599851245818 | -0.017 | 0.041 | -0.05 | 0.081 |
| 94.00334696913353 | -0.019 | 0.045 | -0.052 | 0.084 |
| 94.17069542580886 | -0.022 | 0.049 | -0.053 | 0.085 |
| 94.3380438824842 | -0.025 | 0.053 | -0.054 | 0.086 |
| 94.50539233915954 | -0.027 | 0.055 | -0.054 | 0.089 |
| 94.66344365935292 | -0.03 | 0.059 | -0.055 | 0.093 |
| 94.83079211602828 | -0.028 | 0.063 | -0.055 | 0.094 |
| 94.99814057270362 | -0.025 | 0.067 | -0.057 | 0.097 |
| 95.16548902937897 | -0.022 | 0.07 | -0.058 | 0.098 |
| 95.33283748605432 | -0.021 | 0.071 | -0.059 | 0.099 |
| 95.50018594272963 | -0.018 | 0.072 | -0.061 | 0.101 |
| 95.66753439940499 | -0.018 | 0.071 | -0.062 | 0.101 |
| 95.83488285608034 | -0.019 | 0.067 | -0.063 | 0.099 |
| 96.00223131275567 | -0.021 | 0.065 | -0.063 | 0.098 |
| 96.16957976943102 | -0.025 | 0.061 | -0.063 | 0.095 |
| 96.33692822610638 | -0.027 | 0.057 | -0.063 | 0.094 |
| 96.50427668278171 | -0.027 | 0.055 | -0.063 | 0.093 |
| 96.67162513945706 | -0.026 | 0.055 | -0.063 | 0.092 |
| 96.8389735961324 | -0.025 | 0.054 | -0.063 | 0.09 |
| 96.99702491632577 | -0.023 | 0.053 | -0.063 | 0.09 |
| 97.16437337300111 | -0.022 | 0.053 | -0.065 | 0.089 |
| 97.33172182967647 | -0.023 | 0.05 | -0.065 | 0.089 |
| 97.49907028635181 | -0.022 | 0.05 | -0.065 | 0.088 |
| 97.66641874302715 | -0.022 | 0.049 | -0.065 | 0.088 |
| 97.8337671997025 | -0.022 | 0.046 | -0.063 | 0.085 |
| 98.00111565637785 | -0.021 | 0.046 | -0.063 | 0.084 |
| 98.16846411305319 | -0.022 | 0.045 | -0.062 | 0.084 |
| 98.33581256972855 | -0.022 | 0.045 | -0.061 | 0.083 |
| 98.50316102640389 | -0.021 | 0.045 | -0.061 | 0.081 |
| 98.67050948307921 | -0.023 | 0.044 | -0.059 | 0.081 |
| 98.83785793975456 | -0.025 | 0.044 | -0.058 | 0.081 |
| 99.0052063964299 | -0.027 | 0.044 | -0.057 | 0.081 |
| 99.17255485310525 | -0.027 | 0.046 | -0.055 | 0.081 |
| 99.33060617329863 | -0.028 | 0.048 | -0.054 | 0.081 |
| 99.49795462997399 | -0.028 | 0.049 | -0.053 | 0.081 |
| 99.66530308664933 | -0.027 | 0.049 | -0.053 | 0.08 |
| 99.83265154332467 | -0.026 | 0.048 | -0.05 | 0.079 |
| 100.0 | -0.026 | 0.049 | -0.05 | 0.079 |